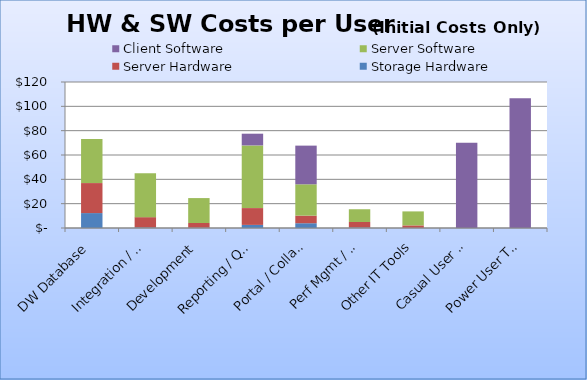
| Category | Storage Hardware | Server Hardware | Server Software | Client Software |
|---|---|---|---|---|
| DW Database | 12.261 | 24.659 | 36.25 | 0 |
| Integration / ETL | 0.492 | 8.428 | 36 | 0 |
| Development | 0.323 | 3.767 | 20.5 | 0 |
| Reporting / Query / OLAP | 2.549 | 13.815 | 51.5 | 9.642 |
| Portal / Collab / Workflow | 3.926 | 6.236 | 25.75 | 31.793 |
| Perf Mgmt / Scorecarding | 0.487 | 4.428 | 10.5 | 0 |
| Other IT Tools | 0.17 | 1.972 | 11.5 | 0 |
| Casual User Tools | 0 | 0 | 0 | 69.977 |
| Power User Tools | 0 | 0 | 0 | 106.595 |